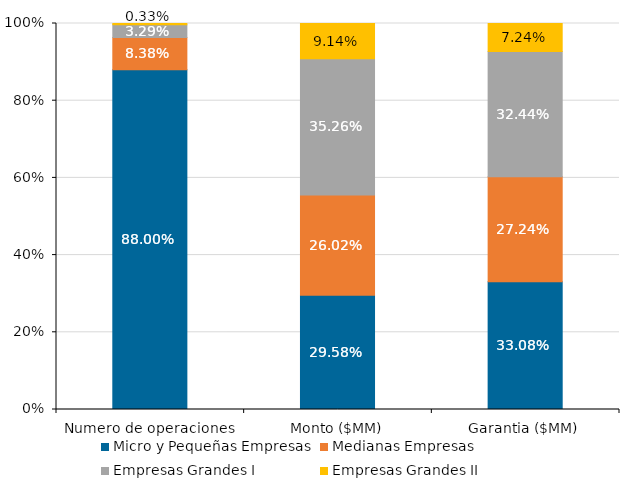
| Category | Micro y Pequeñas Empresas | Medianas Empresas | Empresas Grandes I | Empresas Grandes II |
|---|---|---|---|---|
| Numero de operaciones | 0.88 | 0.084 | 0.033 | 0.003 |
| Monto ($MM) | 0.296 | 0.26 | 0.353 | 0.091 |
| Garantia ($MM) | 0.331 | 0.272 | 0.324 | 0.072 |